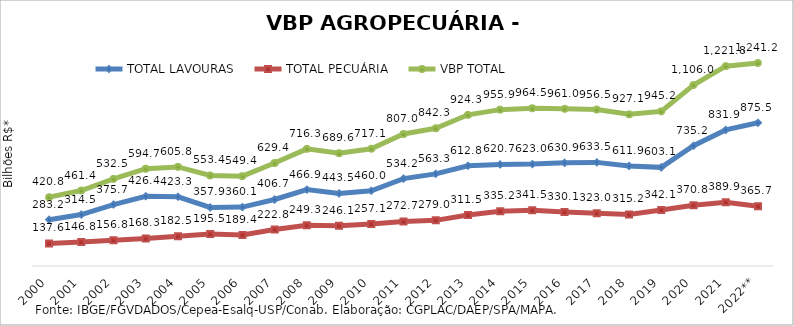
| Category | TOTAL LAVOURAS | TOTAL PECUÁRIA | VBP TOTAL |
|---|---|---|---|
| 2000 | 283.161 | 137.642 | 420.803 |
| 2001 | 314.539 | 146.846 | 461.386 |
| 2002 | 375.728 | 156.759 | 532.487 |
| 2003 | 426.449 | 168.254 | 594.703 |
| 2004 | 423.326 | 182.507 | 605.834 |
| 2005 | 357.903 | 195.51 | 553.413 |
| 2006 | 360.09 | 189.353 | 549.443 |
| 2007 | 406.656 | 222.764 | 629.42 |
| 2008 | 466.941 | 249.326 | 716.267 |
| 2009 | 443.532 | 246.083 | 689.615 |
| 2010 | 459.992 | 257.109 | 717.101 |
| 2011 | 534.224 | 272.727 | 806.951 |
| 2012 | 563.275 | 278.983 | 842.258 |
| 2013 | 612.846 | 311.451 | 924.297 |
| 2014 | 620.731 | 335.21 | 955.941 |
| 2015 | 622.983 | 341.487 | 964.471 |
| 2016 | 630.861 | 330.133 | 960.994 |
| 2017 | 633.48 | 323.039 | 956.52 |
| 2018 | 611.906 | 315.227 | 927.133 |
| 2019 | 603.107 | 342.112 | 945.218 |
| 2020 | 735.201 | 370.827 | 1106.028 |
| 2021 | 831.898 | 389.881 | 1221.779 |
| 2022** | 875.503 | 365.71 | 1241.213 |